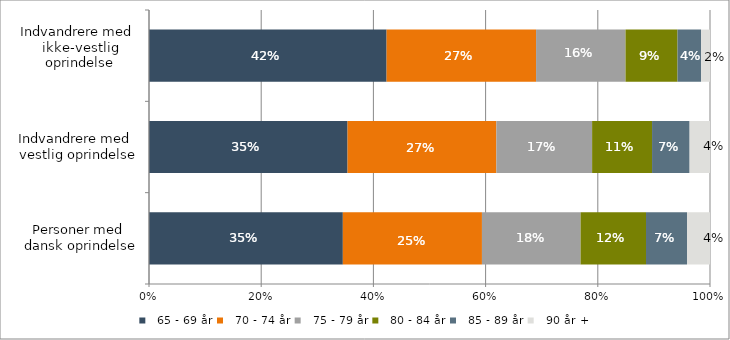
| Category |   65 - 69 år |   70 - 74 år |   75 - 79 år |   80 - 84 år |   85 - 89 år |   90 år + |
|---|---|---|---|---|---|---|
| Personer med 
dansk oprindelse | 0.346 | 0.248 | 0.176 | 0.117 | 0.073 | 0.041 |
| Indvandrere med
 vestlig oprindelse | 0.354 | 0.265 | 0.171 | 0.107 | 0.067 | 0.036 |
| Indvandrere med 
ikke-vestlig oprindelse | 0.424 | 0.266 | 0.159 | 0.093 | 0.042 | 0.016 |